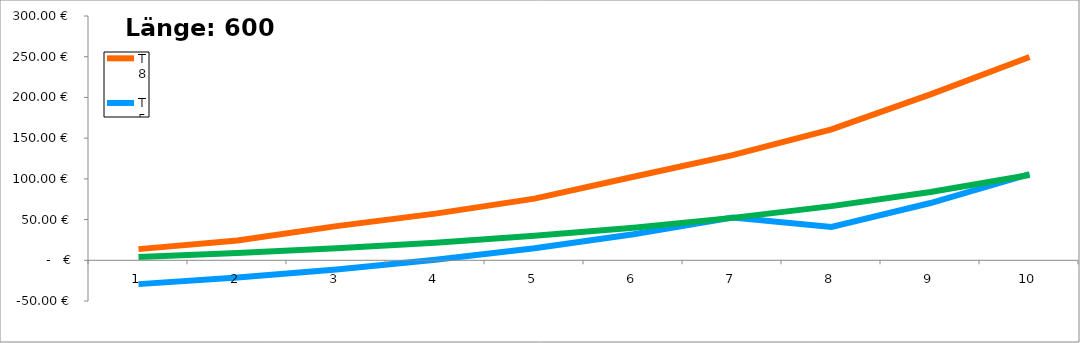
| Category | T8 | T5 | LED |
|---|---|---|---|
| 0 | 13.704 | -29.276 | 4.032 |
| 1 | 24.348 | -21.05 | 8.87 |
| 2 | 41.955 | -11.18 | 14.676 |
| 3 | 57.283 | 0.664 | 21.644 |
| 4 | 75.677 | 14.878 | 30.005 |
| 5 | 102.582 | 31.934 | 40.037 |
| 6 | 129.069 | 52.401 | 52.077 |
| 7 | 160.853 | 40.831 | 66.524 |
| 8 | 203.828 | 70.304 | 83.861 |
| 9 | 249.597 | 105.671 | 104.665 |